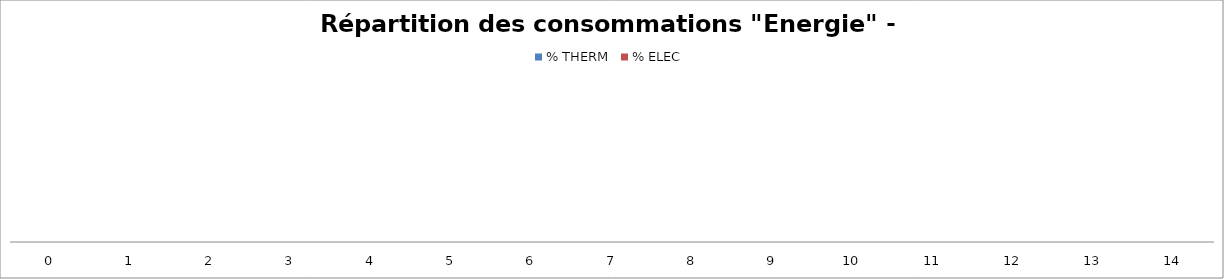
| Category | % THERM | % ELEC |
|---|---|---|
| 0.0 | 0 | 0 |
| 1.0 | 0 | 0 |
| 2.0 | 0 | 0 |
| 3.0 | 0 | 0 |
| 4.0 | 0 | 0 |
| 5.0 | 0 | 0 |
| 6.0 | 0 | 0 |
| 7.0 | 0 | 0 |
| 8.0 | 0 | 0 |
| 9.0 | 0 | 0 |
| 10.0 | 0 | 0 |
| 11.0 | 0 | 0 |
| 12.0 | 0 | 0 |
| 13.0 | 0 | 0 |
| 14.0 | 0 | 0 |